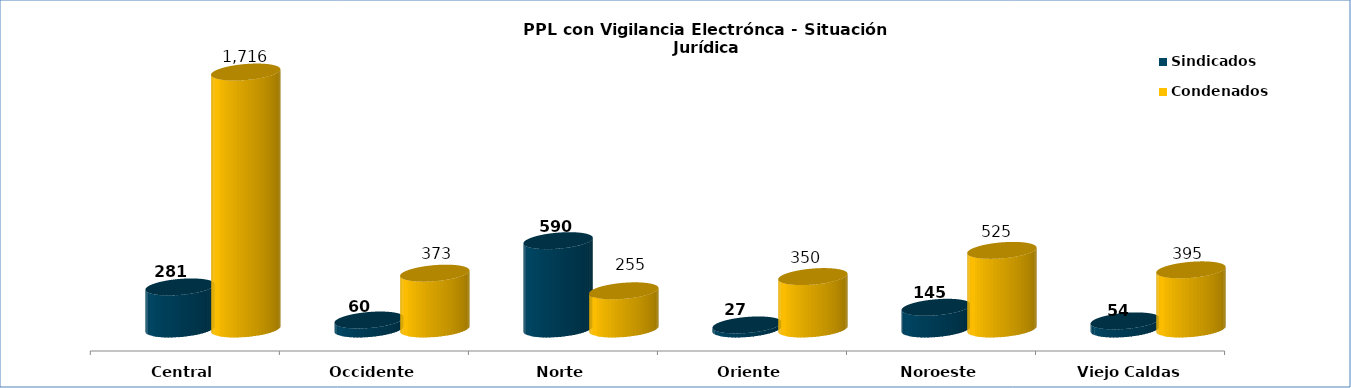
| Category | Sindicados | Condenados |
|---|---|---|
| Central | 281 | 1716 |
| Occidente | 60 | 373 |
| Norte | 590 | 255 |
| Oriente | 27 | 350 |
| Noroeste | 145 | 525 |
| Viejo Caldas | 54 | 395 |